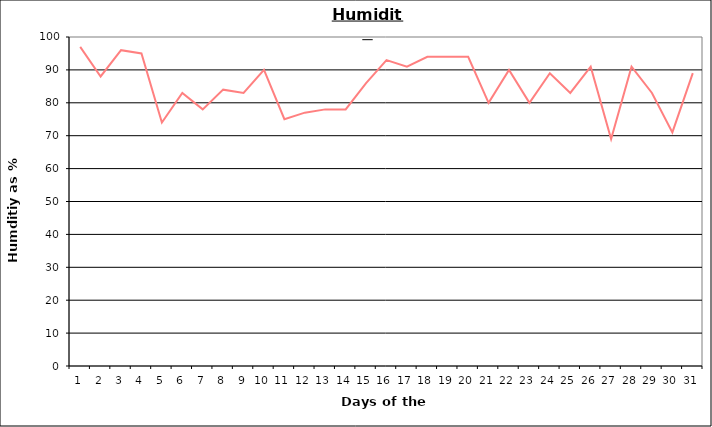
| Category | Series 0 |
|---|---|
| 0 | 97 |
| 1 | 88 |
| 2 | 96 |
| 3 | 95 |
| 4 | 74 |
| 5 | 83 |
| 6 | 78 |
| 7 | 84 |
| 8 | 83 |
| 9 | 90 |
| 10 | 75 |
| 11 | 77 |
| 12 | 78 |
| 13 | 78 |
| 14 | 86 |
| 15 | 93 |
| 16 | 91 |
| 17 | 94 |
| 18 | 94 |
| 19 | 94 |
| 20 | 80 |
| 21 | 90 |
| 22 | 80 |
| 23 | 89 |
| 24 | 83 |
| 25 | 91 |
| 26 | 69 |
| 27 | 91 |
| 28 | 83 |
| 29 | 71 |
| 30 | 89 |